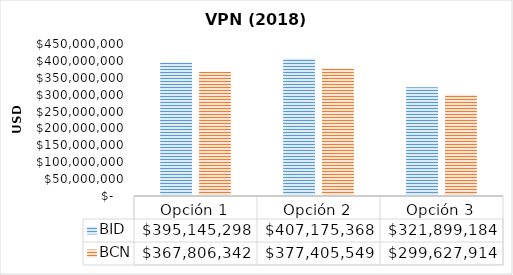
| Category | BID | BCN |
|---|---|---|
| Opción 1 | 395145297.93 | 367806341.693 |
| Opción 2 | 407175368.368 | 377405549.146 |
| Opción 3 | 321899183.883 | 299627913.677 |